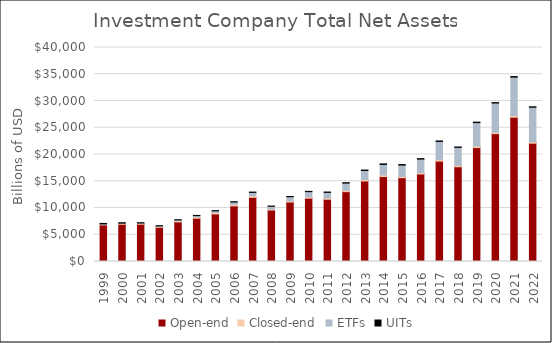
| Category | Open-end | Closed-end | ETFs | UITs |
|---|---|---|---|---|
| 1999.0 | 6834 | 157 | 34 | 92 |
| 2000.0 | 6956 | 150 | 66 | 74 |
| 2001.0 | 6969 | 145 | 83 | 49 |
| 2002.0 | 6380 | 161 | 102 | 36 |
| 2003.0 | 7399 | 216 | 151 | 36 |
| 2004.0 | 8093 | 255 | 228 | 37 |
| 2005.0 | 8889 | 276 | 301 | 41 |
| 2006.0 | 10395 | 299 | 423 | 50 |
| 2007.0 | 11995 | 316 | 608 | 53 |
| 2008.0 | 9619 | 185 | 531 | 29 |
| 2009.0 | 11109 | 224 | 777 | 38 |
| 2010.0 | 11831 | 239 | 992 | 51 |
| 2011.0 | 11630 | 244 | 1048 | 60 |
| 2012.0 | 13054 | 265 | 1337 | 72 |
| 2013.0 | 15049 | 282 | 1675 | 87 |
| 2014.0 | 15877 | 292 | 1975 | 101 |
| 2015.0 | 15658 | 263 | 2101 | 94 |
| 2016.0 | 16353 | 265 | 2524 | 85 |
| 2017.0 | 18764 | 277 | 3401 | 85 |
| 2018.0 | 17707 | 250 | 3371 | 70 |
| 2019.0 | 21292 | 278 | 4396 | 79 |
| 2020.0 | 23896 | 279 | 5449 | 78 |
| 2021.0 | 26964 | 309 | 7191 | 95 |
| 2022.0 | 22110 | 252 | 6476 | 73 |